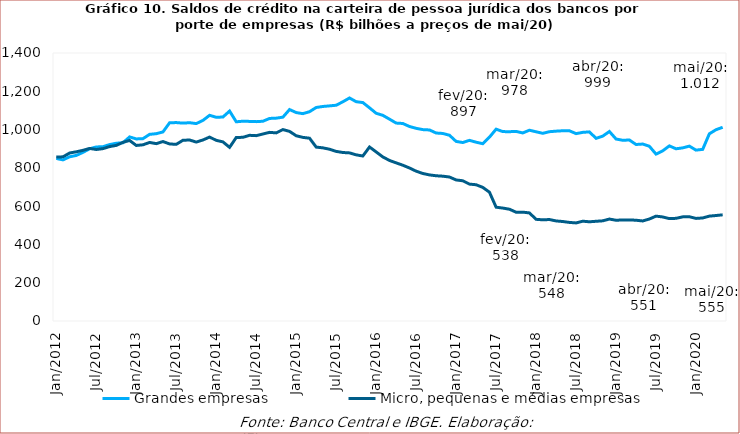
| Category | Grandes empresas | Micro, pequenas e médias empresas |
|---|---|---|
| 2012-01-01 | 849017.622 | 856562.707 |
| 2012-02-01 | 841686.241 | 857577.054 |
| 2012-03-01 | 857861.206 | 877648.409 |
| 2012-04-01 | 865022.33 | 883945.349 |
| 2012-05-01 | 880920.288 | 891542.245 |
| 2012-06-01 | 899703.88 | 901488.299 |
| 2012-07-01 | 909262.999 | 895917.435 |
| 2012-08-01 | 910385.57 | 900439.951 |
| 2012-09-01 | 921743.6 | 911179.13 |
| 2012-10-01 | 928651.457 | 917358.09 |
| 2012-11-01 | 931105.843 | 933361.743 |
| 2012-12-01 | 961585.201 | 943209.121 |
| 2013-01-01 | 951120.471 | 917000.213 |
| 2013-02-01 | 952436.198 | 920428.887 |
| 2013-03-01 | 975062.282 | 932757.629 |
| 2013-04-01 | 978527.329 | 926413.717 |
| 2013-05-01 | 987657.225 | 937505.623 |
| 2013-06-01 | 1035468.139 | 924941.701 |
| 2013-07-01 | 1036545.055 | 922809.214 |
| 2013-08-01 | 1033681.489 | 944142.063 |
| 2013-09-01 | 1035871.122 | 945483.332 |
| 2013-10-01 | 1031240.963 | 934702.364 |
| 2013-11-01 | 1047847.552 | 945649.912 |
| 2013-12-01 | 1074533.713 | 960809.198 |
| 2014-01-01 | 1064093.918 | 943703.053 |
| 2014-02-01 | 1065560.024 | 935770.537 |
| 2014-03-01 | 1096720.194 | 907129.941 |
| 2014-04-01 | 1040671.948 | 958588.718 |
| 2014-05-01 | 1043625.954 | 959525.783 |
| 2014-06-01 | 1042657.819 | 969982.125 |
| 2014-07-01 | 1041437.463 | 968228.384 |
| 2014-08-01 | 1043430.279 | 976951.338 |
| 2014-09-01 | 1058128.579 | 985442.8 |
| 2014-10-01 | 1059625.14 | 982691.032 |
| 2014-11-01 | 1064831.266 | 1000056.783 |
| 2014-12-01 | 1104621.874 | 990531.286 |
| 2015-01-01 | 1088864.988 | 967650.246 |
| 2015-02-01 | 1083193.12 | 959242.619 |
| 2015-03-01 | 1093388.95 | 954874.955 |
| 2015-04-01 | 1115416.596 | 908407.9 |
| 2015-05-01 | 1120679.157 | 904529.307 |
| 2015-06-01 | 1123778.135 | 897283.254 |
| 2015-07-01 | 1127103.053 | 885984.508 |
| 2015-08-01 | 1145184.726 | 880168.627 |
| 2015-09-01 | 1165001.254 | 878192.184 |
| 2015-10-01 | 1145569.298 | 867912.483 |
| 2015-11-01 | 1141146.916 | 862001.982 |
| 2015-12-01 | 1113618.052 | 908957.624 |
| 2016-01-01 | 1085100.068 | 883290.917 |
| 2016-02-01 | 1074375.901 | 857079.971 |
| 2016-03-01 | 1054382.546 | 838612.461 |
| 2016-04-01 | 1033916.013 | 826055.149 |
| 2016-05-01 | 1031764.804 | 813804.727 |
| 2016-06-01 | 1016040.337 | 799309.021 |
| 2016-07-01 | 1006507.999 | 782644.454 |
| 2016-08-01 | 999751.807 | 770603.821 |
| 2016-09-01 | 997965.378 | 763144.986 |
| 2016-10-01 | 981992.42 | 758712.149 |
| 2016-11-01 | 979669.23 | 756484.706 |
| 2016-12-01 | 970329.023 | 752111.711 |
| 2017-01-01 | 938074.054 | 736783.477 |
| 2017-02-01 | 932311.544 | 732553.296 |
| 2017-03-01 | 943677.163 | 715121.623 |
| 2017-04-01 | 934036.96 | 711720.441 |
| 2017-05-01 | 926239.127 | 697933.182 |
| 2017-06-01 | 960373.343 | 672929.326 |
| 2017-07-01 | 1002162.216 | 594508.455 |
| 2017-08-01 | 989423.648 | 589883.442 |
| 2017-09-01 | 988961.976 | 583967.554 |
| 2017-10-01 | 990272.197 | 568205.359 |
| 2017-11-01 | 982448.857 | 568604.335 |
| 2017-12-01 | 996615.825 | 564658.972 |
| 2018-01-01 | 988439.902 | 531103.596 |
| 2018-02-01 | 980436.201 | 528597.497 |
| 2018-03-01 | 988881.294 | 530017.045 |
| 2018-04-01 | 991743.367 | 522725.178 |
| 2018-05-01 | 993795.642 | 519660.329 |
| 2018-06-01 | 993594.419 | 515007.221 |
| 2018-07-01 | 978857.781 | 512358.956 |
| 2018-08-01 | 985381.581 | 521296.047 |
| 2018-09-01 | 987933.049 | 518318.761 |
| 2018-10-01 | 954215.121 | 520861.605 |
| 2018-11-01 | 965693.486 | 523284.563 |
| 2018-12-01 | 989820.069 | 532572.94 |
| 2019-01-01 | 950722.579 | 526270.575 |
| 2019-02-01 | 944061.23 | 527866.75 |
| 2019-03-01 | 945491.489 | 528134.444 |
| 2019-04-01 | 922040.491 | 526372.561 |
| 2019-05-01 | 924380.426 | 522639.872 |
| 2019-06-01 | 912741.552 | 532806.087 |
| 2019-07-01 | 871760.787 | 547804.004 |
| 2019-08-01 | 888906.877 | 543561.724 |
| 2019-09-01 | 914753.46 | 534798.329 |
| 2019-10-01 | 899601.613 | 536348.687 |
| 2019-11-01 | 904345.636 | 543961.005 |
| 2019-12-01 | 913494.976 | 544621.213 |
| 2020-01-01 | 892657.522 | 535914.323 |
| 2020-02-01 | 896566.966 | 538266.745 |
| 2020-03-01 | 977828.08 | 547811.545 |
| 2020-04-01 | 999239.643 | 550968.464 |
| 2020-05-01 | 1011879 | 554650 |